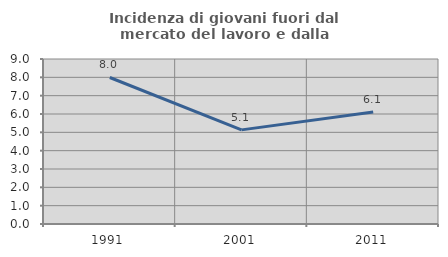
| Category | Incidenza di giovani fuori dal mercato del lavoro e dalla formazione  |
|---|---|
| 1991.0 | 7.992 |
| 2001.0 | 5.134 |
| 2011.0 | 6.109 |